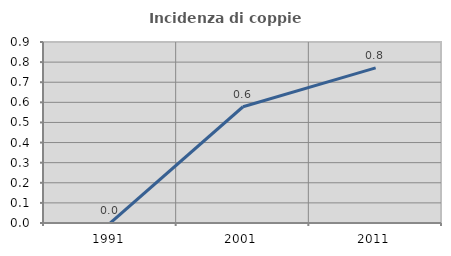
| Category | Incidenza di coppie miste |
|---|---|
| 1991.0 | 0 |
| 2001.0 | 0.578 |
| 2011.0 | 0.771 |